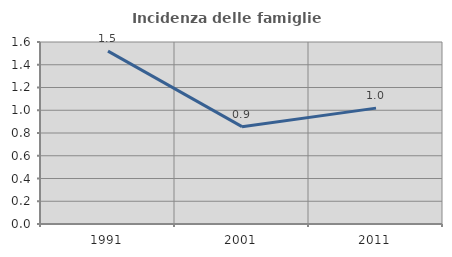
| Category | Incidenza delle famiglie numerose |
|---|---|
| 1991.0 | 1.52 |
| 2001.0 | 0.856 |
| 2011.0 | 1.019 |